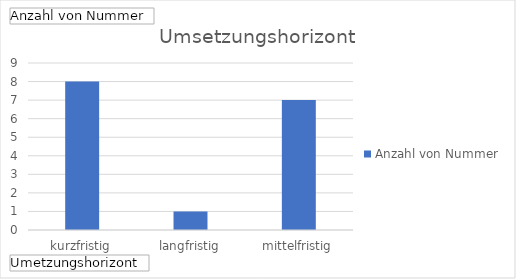
| Category | Ergebnis |
|---|---|
| kurzfristig | 8 |
| langfristig | 1 |
| mittelfristig | 7 |